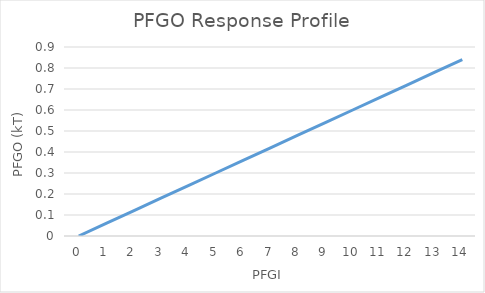
| Category | Series 0 |
|---|---|
| 0.0 | 0 |
| 1.0 | 0.06 |
| 2.0 | 0.12 |
| 3.0 | 0.18 |
| 4.0 | 0.24 |
| 5.0 | 0.3 |
| 6.0 | 0.36 |
| 7.0 | 0.42 |
| 8.0 | 0.48 |
| 9.0 | 0.54 |
| 10.0 | 0.6 |
| 11.0 | 0.66 |
| 12.0 | 0.72 |
| 13.0 | 0.78 |
| 14.0 | 0.84 |